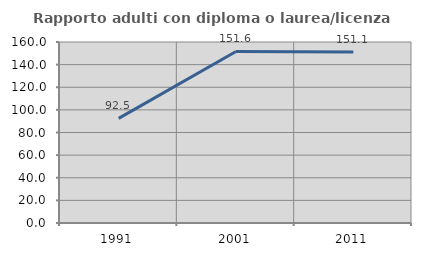
| Category | Rapporto adulti con diploma o laurea/licenza media  |
|---|---|
| 1991.0 | 92.521 |
| 2001.0 | 151.613 |
| 2011.0 | 151.056 |